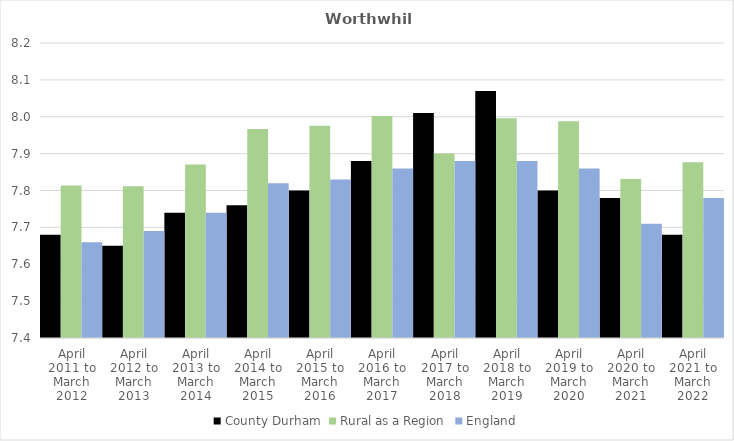
| Category | County Durham | Rural as a Region | England |
|---|---|---|---|
| April 2011 to March 2012 | 7.68 | 7.813 | 7.66 |
| April 2012 to March 2013 | 7.65 | 7.811 | 7.69 |
| April 2013 to March 2014 | 7.74 | 7.871 | 7.74 |
| April 2014 to March 2015 | 7.76 | 7.967 | 7.82 |
| April 2015 to March 2016 | 7.8 | 7.975 | 7.83 |
| April 2016 to March 2017 | 7.88 | 8.002 | 7.86 |
| April 2017 to March 2018 | 8.01 | 7.9 | 7.88 |
| April 2018 to March 2019 | 8.07 | 7.996 | 7.88 |
| April 2019 to March 2020 | 7.8 | 7.988 | 7.86 |
| April 2020 to March 2021 | 7.78 | 7.831 | 7.71 |
| April 2021 to March 2022 | 7.68 | 7.877 | 7.78 |